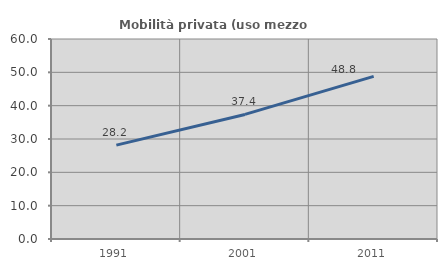
| Category | Mobilità privata (uso mezzo privato) |
|---|---|
| 1991.0 | 28.162 |
| 2001.0 | 37.373 |
| 2011.0 | 48.804 |